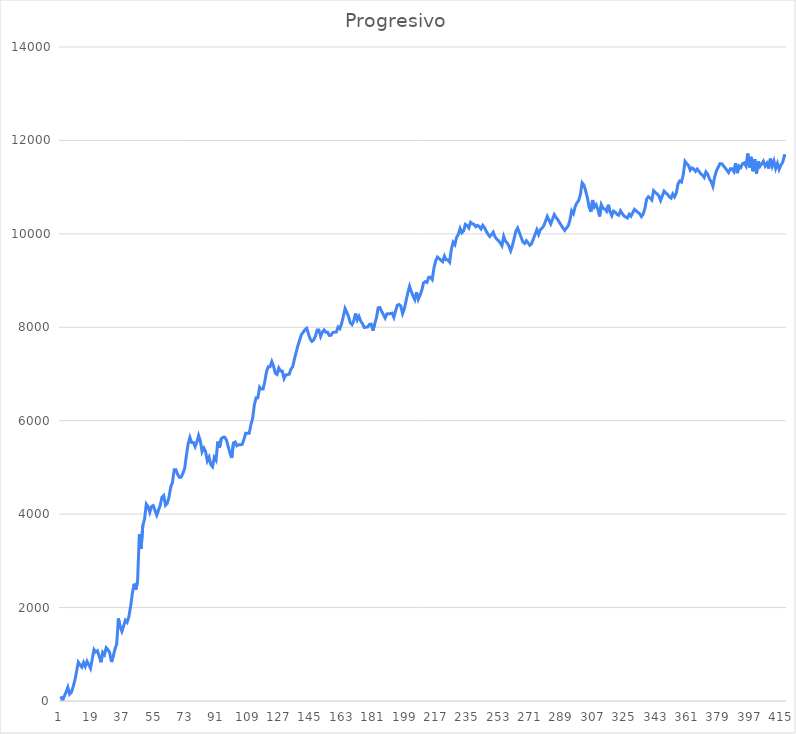
| Category | Series 0 |
|---|---|
| 0 | 100 |
| 1 | 10 |
| 2 | 105 |
| 3 | 195 |
| 4 | 295 |
| 5 | 145 |
| 6 | 185 |
| 7 | 300 |
| 8 | 440 |
| 9 | 630 |
| 10 | 830 |
| 11 | 775 |
| 12 | 725 |
| 13 | 825 |
| 14 | 740 |
| 15 | 850 |
| 16 | 780 |
| 17 | 700 |
| 18 | 900 |
| 19 | 1100 |
| 20 | 1050 |
| 21 | 1075 |
| 22 | 955 |
| 23 | 830 |
| 24 | 1040 |
| 25 | 990 |
| 26 | 1140 |
| 27 | 1100 |
| 28 | 1035 |
| 29 | 835 |
| 30 | 955 |
| 31 | 1105 |
| 32 | 1215 |
| 33 | 1765 |
| 34 | 1590 |
| 35 | 1490 |
| 36 | 1605 |
| 37 | 1730 |
| 38 | 1685 |
| 39 | 1805 |
| 40 | 2025 |
| 41 | 2300 |
| 42 | 2510 |
| 43 | 2385 |
| 44 | 2565 |
| 45 | 3565 |
| 46 | 3255 |
| 47 | 3755 |
| 48 | 3895 |
| 49 | 4215 |
| 50 | 4160 |
| 51 | 4040 |
| 52 | 4164 |
| 53 | 4184 |
| 54 | 4079 |
| 55 | 3979 |
| 56 | 4084 |
| 57 | 4194 |
| 58 | 4364 |
| 59 | 4399 |
| 60 | 4189 |
| 61 | 4229 |
| 62 | 4359 |
| 63 | 4579 |
| 64 | 4679 |
| 65 | 4949 |
| 66 | 4949 |
| 67 | 4849 |
| 68 | 4789 |
| 69 | 4789 |
| 70 | 4874 |
| 71 | 4974 |
| 72 | 5254 |
| 73 | 5504 |
| 74 | 5644 |
| 75 | 5534 |
| 76 | 5534 |
| 77 | 5444 |
| 78 | 5544 |
| 79 | 5684 |
| 80 | 5564 |
| 81 | 5334 |
| 82 | 5414 |
| 83 | 5339 |
| 84 | 5139 |
| 85 | 5219 |
| 86 | 5059 |
| 87 | 5014 |
| 88 | 5214 |
| 89 | 5154 |
| 90 | 5554 |
| 91 | 5424 |
| 92 | 5614 |
| 93 | 5644 |
| 94 | 5644 |
| 95 | 5584 |
| 96 | 5444 |
| 97 | 5304 |
| 98 | 5204 |
| 99 | 5524 |
| 100 | 5544 |
| 101 | 5464 |
| 102 | 5484 |
| 103 | 5484 |
| 104 | 5494 |
| 105 | 5599 |
| 106 | 5729 |
| 107 | 5729 |
| 108 | 5729 |
| 109 | 5914 |
| 110 | 6054 |
| 111 | 6344 |
| 112 | 6492 |
| 113 | 6492 |
| 114 | 6717 |
| 115 | 6677 |
| 116 | 6677 |
| 117 | 6847 |
| 118 | 7057 |
| 119 | 7157 |
| 120 | 7157 |
| 121 | 7267 |
| 122 | 7167 |
| 123 | 7017 |
| 124 | 6992 |
| 125 | 7127 |
| 126 | 7062 |
| 127 | 7062 |
| 128 | 6902 |
| 129 | 6977 |
| 130 | 6987 |
| 131 | 6997 |
| 132 | 7107 |
| 133 | 7157 |
| 134 | 7327 |
| 135 | 7472 |
| 136 | 7612 |
| 137 | 7732 |
| 138 | 7847 |
| 139 | 7892 |
| 140 | 7949.5 |
| 141 | 7979.5 |
| 142 | 7859.5 |
| 143 | 7749.5 |
| 144 | 7699.5 |
| 145 | 7729.5 |
| 146 | 7809.5 |
| 147 | 7939.5 |
| 148 | 7939.5 |
| 149 | 7804.5 |
| 150 | 7899.5 |
| 151 | 7944.5 |
| 152 | 7894.5 |
| 153 | 7894.5 |
| 154 | 7824.5 |
| 155 | 7829.5 |
| 156 | 7889.5 |
| 157 | 7894.5 |
| 158 | 7899.5 |
| 159 | 8004.5 |
| 160 | 7969.5 |
| 161 | 8077 |
| 162 | 8227 |
| 163 | 8402 |
| 164 | 8322 |
| 165 | 8227 |
| 166 | 8097 |
| 167 | 8057 |
| 168 | 8137 |
| 169 | 8297 |
| 170 | 8157 |
| 171 | 8232 |
| 172 | 8132 |
| 173 | 8077 |
| 174 | 7997 |
| 175 | 8002 |
| 176 | 8007 |
| 177 | 8062 |
| 178 | 8067 |
| 179 | 7927 |
| 180 | 8072 |
| 181 | 8202 |
| 182 | 8417 |
| 183 | 8422 |
| 184 | 8342 |
| 185 | 8267 |
| 186 | 8197 |
| 187 | 8287 |
| 188 | 8288 |
| 189 | 8293 |
| 190 | 8303 |
| 191 | 8213 |
| 192 | 8353 |
| 193 | 8473 |
| 194 | 8488 |
| 195 | 8453 |
| 196 | 8293 |
| 197 | 8393 |
| 198 | 8568 |
| 199 | 8738 |
| 200 | 8878 |
| 201 | 8768 |
| 202 | 8671 |
| 203 | 8591 |
| 204 | 8751 |
| 205 | 8596.4 |
| 206 | 8686.4 |
| 207 | 8786.4 |
| 208 | 8948.5 |
| 209 | 8978.4 |
| 210 | 8961.4 |
| 211 | 9073.4 |
| 212 | 9073.4 |
| 213 | 9023.4 |
| 214 | 9273.4 |
| 215 | 9423.4 |
| 216 | 9503.4 |
| 217 | 9473.4 |
| 218 | 9433.4 |
| 219 | 9403.4 |
| 220 | 9523.4 |
| 221 | 9443.4 |
| 222 | 9443.4 |
| 223 | 9394.4 |
| 224 | 9674.4 |
| 225 | 9819.4 |
| 226 | 9769.4 |
| 227 | 9929.4 |
| 228 | 9989.4 |
| 229 | 10114.4 |
| 230 | 10022.4 |
| 231 | 10062.4 |
| 232 | 10202.4 |
| 233 | 10177.4 |
| 234 | 10127.4 |
| 235 | 10247.4 |
| 236 | 10217.4 |
| 237 | 10202.4 |
| 238 | 10152.4 |
| 239 | 10180.4 |
| 240 | 10155.4 |
| 241 | 10105.4 |
| 242 | 10183.4 |
| 243 | 10133.4 |
| 244 | 10053.4 |
| 245 | 9993.4 |
| 246 | 9943.4 |
| 247 | 9983.4 |
| 248 | 10036.4 |
| 249 | 9936.4 |
| 250 | 9886.4 |
| 251 | 9856.4 |
| 252 | 9806.4 |
| 253 | 9746.4 |
| 254 | 9946.4 |
| 255 | 9846.4 |
| 256 | 9806.4 |
| 257 | 9736.4 |
| 258 | 9636.4 |
| 259 | 9750.4 |
| 260 | 9900.4 |
| 261 | 10060.4 |
| 262 | 10125.4 |
| 263 | 10025.4 |
| 264 | 9925.4 |
| 265 | 9825.4 |
| 266 | 9795.4 |
| 267 | 9855.4 |
| 268 | 9805.4 |
| 269 | 9755.4 |
| 270 | 9790.4 |
| 271 | 9890.4 |
| 272 | 9988.4 |
| 273 | 10088.4 |
| 274 | 9988.4 |
| 275 | 10088.4 |
| 276 | 10123.4 |
| 277 | 10173.4 |
| 278 | 10273.4 |
| 279 | 10373.4 |
| 280 | 10293.4 |
| 281 | 10213.4 |
| 282 | 10313.4 |
| 283 | 10413.4 |
| 284 | 10353.4 |
| 285 | 10303.4 |
| 286 | 10243.4 |
| 287 | 10183.4 |
| 288 | 10123.4 |
| 289 | 10073.4 |
| 290 | 10123.4 |
| 291 | 10173.4 |
| 292 | 10293.4 |
| 293 | 10493.4 |
| 294 | 10433.4 |
| 295 | 10583.4 |
| 296 | 10663.4 |
| 297 | 10713.4 |
| 298 | 10843.4 |
| 299 | 11093.4 |
| 300 | 11043.4 |
| 301 | 10923.4 |
| 302 | 10773.4 |
| 303 | 10573.4 |
| 304 | 10473.4 |
| 305 | 10723.4 |
| 306 | 10573.4 |
| 307 | 10623.4 |
| 308 | 10523.4 |
| 309 | 10373.4 |
| 310 | 10623.4 |
| 311 | 10543.4 |
| 312 | 10533.4 |
| 313 | 10483.4 |
| 314 | 10623.4 |
| 315 | 10473.4 |
| 316 | 10388.4 |
| 317 | 10488.4 |
| 318 | 10463.4 |
| 319 | 10418.4 |
| 320 | 10398.4 |
| 321 | 10494.4 |
| 322 | 10434.4 |
| 323 | 10384.4 |
| 324 | 10359.4 |
| 325 | 10339.4 |
| 326 | 10419.4 |
| 327 | 10379.4 |
| 328 | 10454.4 |
| 329 | 10524.4 |
| 330 | 10489.4 |
| 331 | 10459.4 |
| 332 | 10429.4 |
| 333 | 10369.4 |
| 334 | 10424.4 |
| 335 | 10544.4 |
| 336 | 10744.4 |
| 337 | 10794.4 |
| 338 | 10764.4 |
| 339 | 10724.4 |
| 340 | 10924.4 |
| 341 | 10884.4 |
| 342 | 10854.4 |
| 343 | 10814.4 |
| 344 | 10714.4 |
| 345 | 10814.4 |
| 346 | 10914.4 |
| 347 | 10874.4 |
| 348 | 10844.4 |
| 349 | 10794.4 |
| 350 | 10764.4 |
| 351 | 10854.4 |
| 352 | 10794.4 |
| 353 | 10872.4 |
| 354 | 11072.4 |
| 355 | 11132.4 |
| 356 | 11107.4 |
| 357 | 11267.4 |
| 358 | 11552.4 |
| 359 | 11502.4 |
| 360 | 11462.4 |
| 361 | 11362.4 |
| 362 | 11412.4 |
| 363 | 11387.4 |
| 364 | 11337.4 |
| 365 | 11387.4 |
| 366 | 11337.4 |
| 367 | 11287.4 |
| 368 | 11257.4 |
| 369 | 11207.4 |
| 370 | 11327.4 |
| 371 | 11277.4 |
| 372 | 11177.4 |
| 373 | 11117.4 |
| 374 | 11017.4 |
| 375 | 11217.4 |
| 376 | 11347.4 |
| 377 | 11422.4 |
| 378 | 11502.4 |
| 379 | 11502.4 |
| 380 | 11462.4 |
| 381 | 11412.4 |
| 382 | 11362.4 |
| 383 | 11312.4 |
| 384 | 11392.4 |
| 385 | 11392.4 |
| 386 | 11332.4 |
| 387 | 11512.4 |
| 388 | 11299.4 |
| 389 | 11452.4 |
| 390 | 11419.4 |
| 391 | 11502.4 |
| 392 | 11519.4 |
| 393 | 11452.4 |
| 394 | 11719.4 |
| 395 | 11422.4 |
| 396 | 11649.4 |
| 397 | 11340.4 |
| 398 | 11599.4 |
| 399 | 11290.4 |
| 400 | 11549.4 |
| 401 | 11445.4 |
| 402 | 11499.4 |
| 403 | 11555.4 |
| 404 | 11449.4 |
| 405 | 11510.4 |
| 406 | 11399.4 |
| 407 | 11610.4 |
| 408 | 11449.4 |
| 409 | 11560.4 |
| 410 | 11399.4 |
| 411 | 11510.4 |
| 412 | 11379.4 |
| 413 | 11475.4 |
| 414 | 11529.4 |
| 415 | 11675.4 |
| 416 | 11669.4 |